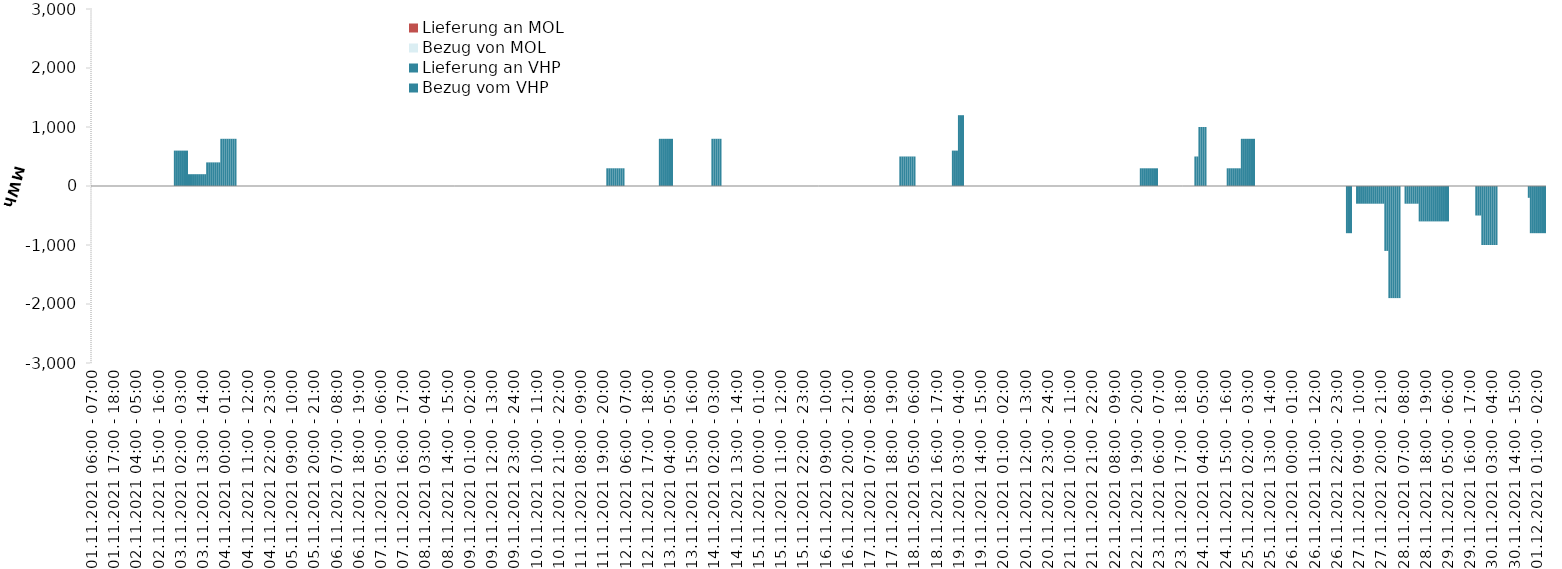
| Category | Bezug vom VHP | Lieferung an VHP | Bezug von MOL | Lieferung an MOL |
|---|---|---|---|---|
| 01.11.2021 06:00 - 07:00 | 0 | 0 | 0 | 0 |
| 01.11.2021 07:00 - 08:00 | 0 | 0 | 0 | 0 |
| 01.11.2021 08:00 - 09:00 | 0 | 0 | 0 | 0 |
| 01.11.2021 09:00 - 10:00 | 0 | 0 | 0 | 0 |
| 01.11.2021 10:00 - 11:00 | 0 | 0 | 0 | 0 |
| 01.11.2021 11:00 - 12:00 | 0 | 0 | 0 | 0 |
| 01.11.2021 12:00 - 13:00 | 0 | 0 | 0 | 0 |
| 01.11.2021 13:00 - 14:00 | 0 | 0 | 0 | 0 |
| 01.11.2021 14:00 - 15:00 | 0 | 0 | 0 | 0 |
| 01.11.2021 15:00 - 16:00 | 0 | 0 | 0 | 0 |
| 01.11.2021 16:00 - 17:00 | 0 | 0 | 0 | 0 |
| 01.11.2021 17:00 - 18:00 | 0 | 0 | 0 | 0 |
| 01.11.2021 18:00 - 19:00 | 0 | 0 | 0 | 0 |
| 01.11.2021 19:00 - 20:00 | 0 | 0 | 0 | 0 |
| 01.11.2021 20:00 - 21:00 | 0 | 0 | 0 | 0 |
| 01.11.2021 21:00 - 22:00 | 0 | 0 | 0 | 0 |
| 01.11.2021 22:00 - 23:00 | 0 | 0 | 0 | 0 |
| 01.11.2021 23:00 - 24:00 | 0 | 0 | 0 | 0 |
| 02.11.2021 00:00 - 01:00 | 0 | 0 | 0 | 0 |
| 02.11.2021 01:00 - 02:00 | 0 | 0 | 0 | 0 |
| 02.11.2021 02:00 - 03:00 | 0 | 0 | 0 | 0 |
| 02.11.2021 03:00 - 04:00 | 0 | 0 | 0 | 0 |
| 02.11.2021 04:00 - 05:00 | 0 | 0 | 0 | 0 |
| 02.11.2021 05:00 - 06:00 | 0 | 0 | 0 | 0 |
| 02.11.2021 06:00 - 07:00 | 0 | 0 | 0 | 0 |
| 02.11.2021 07:00 - 08:00 | 0 | 0 | 0 | 0 |
| 02.11.2021 08:00 - 09:00 | 0 | 0 | 0 | 0 |
| 02.11.2021 09:00 - 10:00 | 0 | 0 | 0 | 0 |
| 02.11.2021 10:00 - 11:00 | 0 | 0 | 0 | 0 |
| 02.11.2021 11:00 - 12:00 | 0 | 0 | 0 | 0 |
| 02.11.2021 12:00 - 13:00 | 0 | 0 | 0 | 0 |
| 02.11.2021 13:00 - 14:00 | 0 | 0 | 0 | 0 |
| 02.11.2021 14:00 - 15:00 | 0 | 0 | 0 | 0 |
| 02.11.2021 15:00 - 16:00 | 0 | 0 | 0 | 0 |
| 02.11.2021 16:00 - 17:00 | 0 | 0 | 0 | 0 |
| 02.11.2021 17:00 - 18:00 | 0 | 0 | 0 | 0 |
| 02.11.2021 18:00 - 19:00 | 0 | 0 | 0 | 0 |
| 02.11.2021 19:00 - 20:00 | 0 | 0 | 0 | 0 |
| 02.11.2021 20:00 - 21:00 | 0 | 0 | 0 | 0 |
| 02.11.2021 21:00 - 22:00 | 0 | 0 | 0 | 0 |
| 02.11.2021 22:00 - 23:00 | 0 | 0 | 0 | 0 |
| 02.11.2021 23:00 - 24:00 | 600 | 0 | 0 | 0 |
| 03.11.2021 00:00 - 01:00 | 600 | 0 | 0 | 0 |
| 03.11.2021 01:00 - 02:00 | 600 | 0 | 0 | 0 |
| 03.11.2021 02:00 - 03:00 | 600 | 0 | 0 | 0 |
| 03.11.2021 03:00 - 04:00 | 600 | 0 | 0 | 0 |
| 03.11.2021 04:00 - 05:00 | 600 | 0 | 0 | 0 |
| 03.11.2021 05:00 - 06:00 | 600 | 0 | 0 | 0 |
| 03.11.2021 06:00 - 07:00 | 200 | 0 | 0 | 0 |
| 03.11.2021 07:00 - 08:00 | 200 | 0 | 0 | 0 |
| 03.11.2021 08:00 - 09:00 | 200 | 0 | 0 | 0 |
| 03.11.2021 09:00 - 10:00 | 200 | 0 | 0 | 0 |
| 03.11.2021 10:00 - 11:00 | 200 | 0 | 0 | 0 |
| 03.11.2021 11:00 - 12:00 | 200 | 0 | 0 | 0 |
| 03.11.2021 12:00 - 13:00 | 200 | 0 | 0 | 0 |
| 03.11.2021 13:00 - 14:00 | 200 | 0 | 0 | 0 |
| 03.11.2021 14:00 - 15:00 | 200 | 0 | 0 | 0 |
| 03.11.2021 15:00 - 16:00 | 400 | 0 | 0 | 0 |
| 03.11.2021 16:00 - 17:00 | 400 | 0 | 0 | 0 |
| 03.11.2021 17:00 - 18:00 | 400 | 0 | 0 | 0 |
| 03.11.2021 18:00 - 19:00 | 400 | 0 | 0 | 0 |
| 03.11.2021 19:00 - 20:00 | 400 | 0 | 0 | 0 |
| 03.11.2021 20:00 - 21:00 | 400 | 0 | 0 | 0 |
| 03.11.2021 21:00 - 22:00 | 400 | 0 | 0 | 0 |
| 03.11.2021 22:00 - 23:00 | 800 | 0 | 0 | 0 |
| 03.11.2021 23:00 - 24:00 | 800 | 0 | 0 | 0 |
| 04.11.2021 00:00 - 01:00 | 800 | 0 | 0 | 0 |
| 04.11.2021 01:00 - 02:00 | 800 | 0 | 0 | 0 |
| 04.11.2021 02:00 - 03:00 | 800 | 0 | 0 | 0 |
| 04.11.2021 03:00 - 04:00 | 800 | 0 | 0 | 0 |
| 04.11.2021 04:00 - 05:00 | 800 | 0 | 0 | 0 |
| 04.11.2021 05:00 - 06:00 | 800 | 0 | 0 | 0 |
| 04.11.2021 06:00 - 07:00 | 0 | 0 | 0 | 0 |
| 04.11.2021 07:00 - 08:00 | 0 | 0 | 0 | 0 |
| 04.11.2021 08:00 - 09:00 | 0 | 0 | 0 | 0 |
| 04.11.2021 09:00 - 10:00 | 0 | 0 | 0 | 0 |
| 04.11.2021 10:00 - 11:00 | 0 | 0 | 0 | 0 |
| 04.11.2021 11:00 - 12:00 | 0 | 0 | 0 | 0 |
| 04.11.2021 12:00 - 13:00 | 0 | 0 | 0 | 0 |
| 04.11.2021 13:00 - 14:00 | 0 | 0 | 0 | 0 |
| 04.11.2021 14:00 - 15:00 | 0 | 0 | 0 | 0 |
| 04.11.2021 15:00 - 16:00 | 0 | 0 | 0 | 0 |
| 04.11.2021 16:00 - 17:00 | 0 | 0 | 0 | 0 |
| 04.11.2021 17:00 - 18:00 | 0 | 0 | 0 | 0 |
| 04.11.2021 18:00 - 19:00 | 0 | 0 | 0 | 0 |
| 04.11.2021 19:00 - 20:00 | 0 | 0 | 0 | 0 |
| 04.11.2021 20:00 - 21:00 | 0 | 0 | 0 | 0 |
| 04.11.2021 21:00 - 22:00 | 0 | 0 | 0 | 0 |
| 04.11.2021 22:00 - 23:00 | 0 | 0 | 0 | 0 |
| 04.11.2021 23:00 - 24:00 | 0 | 0 | 0 | 0 |
| 05.11.2021 00:00 - 01:00 | 0 | 0 | 0 | 0 |
| 05.11.2021 01:00 - 02:00 | 0 | 0 | 0 | 0 |
| 05.11.2021 02:00 - 03:00 | 0 | 0 | 0 | 0 |
| 05.11.2021 03:00 - 04:00 | 0 | 0 | 0 | 0 |
| 05.11.2021 04:00 - 05:00 | 0 | 0 | 0 | 0 |
| 05.11.2021 05:00 - 06:00 | 0 | 0 | 0 | 0 |
| 05.11.2021 06:00 - 07:00 | 0 | 0 | 0 | 0 |
| 05.11.2021 07:00 - 08:00 | 0 | 0 | 0 | 0 |
| 05.11.2021 08:00 - 09:00 | 0 | 0 | 0 | 0 |
| 05.11.2021 09:00 - 10:00 | 0 | 0 | 0 | 0 |
| 05.11.2021 10:00 - 11:00 | 0 | 0 | 0 | 0 |
| 05.11.2021 11:00 - 12:00 | 0 | 0 | 0 | 0 |
| 05.11.2021 12:00 - 13:00 | 0 | 0 | 0 | 0 |
| 05.11.2021 13:00 - 14:00 | 0 | 0 | 0 | 0 |
| 05.11.2021 14:00 - 15:00 | 0 | 0 | 0 | 0 |
| 05.11.2021 15:00 - 16:00 | 0 | 0 | 0 | 0 |
| 05.11.2021 16:00 - 17:00 | 0 | 0 | 0 | 0 |
| 05.11.2021 17:00 - 18:00 | 0 | 0 | 0 | 0 |
| 05.11.2021 18:00 - 19:00 | 0 | 0 | 0 | 0 |
| 05.11.2021 19:00 - 20:00 | 0 | 0 | 0 | 0 |
| 05.11.2021 20:00 - 21:00 | 0 | 0 | 0 | 0 |
| 05.11.2021 21:00 - 22:00 | 0 | 0 | 0 | 0 |
| 05.11.2021 22:00 - 23:00 | 0 | 0 | 0 | 0 |
| 05.11.2021 23:00 - 24:00 | 0 | 0 | 0 | 0 |
| 06.11.2021 00:00 - 01:00 | 0 | 0 | 0 | 0 |
| 06.11.2021 01:00 - 02:00 | 0 | 0 | 0 | 0 |
| 06.11.2021 02:00 - 03:00 | 0 | 0 | 0 | 0 |
| 06.11.2021 03:00 - 04:00 | 0 | 0 | 0 | 0 |
| 06.11.2021 04:00 - 05:00 | 0 | 0 | 0 | 0 |
| 06.11.2021 05:00 - 06:00 | 0 | 0 | 0 | 0 |
| 06.11.2021 06:00 - 07:00 | 0 | 0 | 0 | 0 |
| 06.11.2021 07:00 - 08:00 | 0 | 0 | 0 | 0 |
| 06.11.2021 08:00 - 09:00 | 0 | 0 | 0 | 0 |
| 06.11.2021 09:00 - 10:00 | 0 | 0 | 0 | 0 |
| 06.11.2021 10:00 - 11:00 | 0 | 0 | 0 | 0 |
| 06.11.2021 11:00 - 12:00 | 0 | 0 | 0 | 0 |
| 06.11.2021 12:00 - 13:00 | 0 | 0 | 0 | 0 |
| 06.11.2021 13:00 - 14:00 | 0 | 0 | 0 | 0 |
| 06.11.2021 14:00 - 15:00 | 0 | 0 | 0 | 0 |
| 06.11.2021 15:00 - 16:00 | 0 | 0 | 0 | 0 |
| 06.11.2021 16:00 - 17:00 | 0 | 0 | 0 | 0 |
| 06.11.2021 17:00 - 18:00 | 0 | 0 | 0 | 0 |
| 06.11.2021 18:00 - 19:00 | 0 | 0 | 0 | 0 |
| 06.11.2021 19:00 - 20:00 | 0 | 0 | 0 | 0 |
| 06.11.2021 20:00 - 21:00 | 0 | 0 | 0 | 0 |
| 06.11.2021 21:00 - 22:00 | 0 | 0 | 0 | 0 |
| 06.11.2021 22:00 - 23:00 | 0 | 0 | 0 | 0 |
| 06.11.2021 23:00 - 24:00 | 0 | 0 | 0 | 0 |
| 07.11.2021 00:00 - 01:00 | 0 | 0 | 0 | 0 |
| 07.11.2021 01:00 - 02:00 | 0 | 0 | 0 | 0 |
| 07.11.2021 02:00 - 03:00 | 0 | 0 | 0 | 0 |
| 07.11.2021 03:00 - 04:00 | 0 | 0 | 0 | 0 |
| 07.11.2021 04:00 - 05:00 | 0 | 0 | 0 | 0 |
| 07.11.2021 05:00 - 06:00 | 0 | 0 | 0 | 0 |
| 07.11.2021 06:00 - 07:00 | 0 | 0 | 0 | 0 |
| 07.11.2021 07:00 - 08:00 | 0 | 0 | 0 | 0 |
| 07.11.2021 08:00 - 09:00 | 0 | 0 | 0 | 0 |
| 07.11.2021 09:00 - 10:00 | 0 | 0 | 0 | 0 |
| 07.11.2021 10:00 - 11:00 | 0 | 0 | 0 | 0 |
| 07.11.2021 11:00 - 12:00 | 0 | 0 | 0 | 0 |
| 07.11.2021 12:00 - 13:00 | 0 | 0 | 0 | 0 |
| 07.11.2021 13:00 - 14:00 | 0 | 0 | 0 | 0 |
| 07.11.2021 14:00 - 15:00 | 0 | 0 | 0 | 0 |
| 07.11.2021 15:00 - 16:00 | 0 | 0 | 0 | 0 |
| 07.11.2021 16:00 - 17:00 | 0 | 0 | 0 | 0 |
| 07.11.2021 17:00 - 18:00 | 0 | 0 | 0 | 0 |
| 07.11.2021 18:00 - 19:00 | 0 | 0 | 0 | 0 |
| 07.11.2021 19:00 - 20:00 | 0 | 0 | 0 | 0 |
| 07.11.2021 20:00 - 21:00 | 0 | 0 | 0 | 0 |
| 07.11.2021 21:00 - 22:00 | 0 | 0 | 0 | 0 |
| 07.11.2021 22:00 - 23:00 | 0 | 0 | 0 | 0 |
| 07.11.2021 23:00 - 24:00 | 0 | 0 | 0 | 0 |
| 08.11.2021 00:00 - 01:00 | 0 | 0 | 0 | 0 |
| 08.11.2021 01:00 - 02:00 | 0 | 0 | 0 | 0 |
| 08.11.2021 02:00 - 03:00 | 0 | 0 | 0 | 0 |
| 08.11.2021 03:00 - 04:00 | 0 | 0 | 0 | 0 |
| 08.11.2021 04:00 - 05:00 | 0 | 0 | 0 | 0 |
| 08.11.2021 05:00 - 06:00 | 0 | 0 | 0 | 0 |
| 08.11.2021 06:00 - 07:00 | 0 | 0 | 0 | 0 |
| 08.11.2021 07:00 - 08:00 | 0 | 0 | 0 | 0 |
| 08.11.2021 08:00 - 09:00 | 0 | 0 | 0 | 0 |
| 08.11.2021 09:00 - 10:00 | 0 | 0 | 0 | 0 |
| 08.11.2021 10:00 - 11:00 | 0 | 0 | 0 | 0 |
| 08.11.2021 11:00 - 12:00 | 0 | 0 | 0 | 0 |
| 08.11.2021 12:00 - 13:00 | 0 | 0 | 0 | 0 |
| 08.11.2021 13:00 - 14:00 | 0 | 0 | 0 | 0 |
| 08.11.2021 14:00 - 15:00 | 0 | 0 | 0 | 0 |
| 08.11.2021 15:00 - 16:00 | 0 | 0 | 0 | 0 |
| 08.11.2021 16:00 - 17:00 | 0 | 0 | 0 | 0 |
| 08.11.2021 17:00 - 18:00 | 0 | 0 | 0 | 0 |
| 08.11.2021 18:00 - 19:00 | 0 | 0 | 0 | 0 |
| 08.11.2021 19:00 - 20:00 | 0 | 0 | 0 | 0 |
| 08.11.2021 20:00 - 21:00 | 0 | 0 | 0 | 0 |
| 08.11.2021 21:00 - 22:00 | 0 | 0 | 0 | 0 |
| 08.11.2021 22:00 - 23:00 | 0 | 0 | 0 | 0 |
| 08.11.2021 23:00 - 24:00 | 0 | 0 | 0 | 0 |
| 09.11.2021 00:00 - 01:00 | 0 | 0 | 0 | 0 |
| 09.11.2021 01:00 - 02:00 | 0 | 0 | 0 | 0 |
| 09.11.2021 02:00 - 03:00 | 0 | 0 | 0 | 0 |
| 09.11.2021 03:00 - 04:00 | 0 | 0 | 0 | 0 |
| 09.11.2021 04:00 - 05:00 | 0 | 0 | 0 | 0 |
| 09.11.2021 05:00 - 06:00 | 0 | 0 | 0 | 0 |
| 09.11.2021 06:00 - 07:00 | 0 | 0 | 0 | 0 |
| 09.11.2021 07:00 - 08:00 | 0 | 0 | 0 | 0 |
| 09.11.2021 08:00 - 09:00 | 0 | 0 | 0 | 0 |
| 09.11.2021 09:00 - 10:00 | 0 | 0 | 0 | 0 |
| 09.11.2021 10:00 - 11:00 | 0 | 0 | 0 | 0 |
| 09.11.2021 11:00 - 12:00 | 0 | 0 | 0 | 0 |
| 09.11.2021 12:00 - 13:00 | 0 | 0 | 0 | 0 |
| 09.11.2021 13:00 - 14:00 | 0 | 0 | 0 | 0 |
| 09.11.2021 14:00 - 15:00 | 0 | 0 | 0 | 0 |
| 09.11.2021 15:00 - 16:00 | 0 | 0 | 0 | 0 |
| 09.11.2021 16:00 - 17:00 | 0 | 0 | 0 | 0 |
| 09.11.2021 17:00 - 18:00 | 0 | 0 | 0 | 0 |
| 09.11.2021 18:00 - 19:00 | 0 | 0 | 0 | 0 |
| 09.11.2021 19:00 - 20:00 | 0 | 0 | 0 | 0 |
| 09.11.2021 20:00 - 21:00 | 0 | 0 | 0 | 0 |
| 09.11.2021 21:00 - 22:00 | 0 | 0 | 0 | 0 |
| 09.11.2021 22:00 - 23:00 | 0 | 0 | 0 | 0 |
| 09.11.2021 23:00 - 24:00 | 0 | 0 | 0 | 0 |
| 10.11.2021 00:00 - 01:00 | 0 | 0 | 0 | 0 |
| 10.11.2021 01:00 - 02:00 | 0 | 0 | 0 | 0 |
| 10.11.2021 02:00 - 03:00 | 0 | 0 | 0 | 0 |
| 10.11.2021 03:00 - 04:00 | 0 | 0 | 0 | 0 |
| 10.11.2021 04:00 - 05:00 | 0 | 0 | 0 | 0 |
| 10.11.2021 05:00 - 06:00 | 0 | 0 | 0 | 0 |
| 10.11.2021 06:00 - 07:00 | 0 | 0 | 0 | 0 |
| 10.11.2021 07:00 - 08:00 | 0 | 0 | 0 | 0 |
| 10.11.2021 08:00 - 09:00 | 0 | 0 | 0 | 0 |
| 10.11.2021 09:00 - 10:00 | 0 | 0 | 0 | 0 |
| 10.11.2021 10:00 - 11:00 | 0 | 0 | 0 | 0 |
| 10.11.2021 11:00 - 12:00 | 0 | 0 | 0 | 0 |
| 10.11.2021 12:00 - 13:00 | 0 | 0 | 0 | 0 |
| 10.11.2021 13:00 - 14:00 | 0 | 0 | 0 | 0 |
| 10.11.2021 14:00 - 15:00 | 0 | 0 | 0 | 0 |
| 10.11.2021 15:00 - 16:00 | 0 | 0 | 0 | 0 |
| 10.11.2021 16:00 - 17:00 | 0 | 0 | 0 | 0 |
| 10.11.2021 17:00 - 18:00 | 0 | 0 | 0 | 0 |
| 10.11.2021 18:00 - 19:00 | 0 | 0 | 0 | 0 |
| 10.11.2021 19:00 - 20:00 | 0 | 0 | 0 | 0 |
| 10.11.2021 20:00 - 21:00 | 0 | 0 | 0 | 0 |
| 10.11.2021 21:00 - 22:00 | 0 | 0 | 0 | 0 |
| 10.11.2021 22:00 - 23:00 | 0 | 0 | 0 | 0 |
| 10.11.2021 23:00 - 24:00 | 0 | 0 | 0 | 0 |
| 11.11.2021 00:00 - 01:00 | 0 | 0 | 0 | 0 |
| 11.11.2021 01:00 - 02:00 | 0 | 0 | 0 | 0 |
| 11.11.2021 02:00 - 03:00 | 0 | 0 | 0 | 0 |
| 11.11.2021 03:00 - 04:00 | 0 | 0 | 0 | 0 |
| 11.11.2021 04:00 - 05:00 | 0 | 0 | 0 | 0 |
| 11.11.2021 05:00 - 06:00 | 0 | 0 | 0 | 0 |
| 11.11.2021 06:00 - 07:00 | 0 | 0 | 0 | 0 |
| 11.11.2021 07:00 - 08:00 | 0 | 0 | 0 | 0 |
| 11.11.2021 08:00 - 09:00 | 0 | 0 | 0 | 0 |
| 11.11.2021 09:00 - 10:00 | 0 | 0 | 0 | 0 |
| 11.11.2021 10:00 - 11:00 | 0 | 0 | 0 | 0 |
| 11.11.2021 11:00 - 12:00 | 0 | 0 | 0 | 0 |
| 11.11.2021 12:00 - 13:00 | 0 | 0 | 0 | 0 |
| 11.11.2021 13:00 - 14:00 | 0 | 0 | 0 | 0 |
| 11.11.2021 14:00 - 15:00 | 0 | 0 | 0 | 0 |
| 11.11.2021 15:00 - 16:00 | 0 | 0 | 0 | 0 |
| 11.11.2021 16:00 - 17:00 | 0 | 0 | 0 | 0 |
| 11.11.2021 17:00 - 18:00 | 0 | 0 | 0 | 0 |
| 11.11.2021 18:00 - 19:00 | 0 | 0 | 0 | 0 |
| 11.11.2021 19:00 - 20:00 | 0 | 0 | 0 | 0 |
| 11.11.2021 20:00 - 21:00 | 0 | 0 | 0 | 0 |
| 11.11.2021 21:00 - 22:00 | 300 | 0 | 0 | 0 |
| 11.11.2021 22:00 - 23:00 | 300 | 0 | 0 | 0 |
| 11.11.2021 23:00 - 24:00 | 300 | 0 | 0 | 0 |
| 12.11.2021 00:00 - 01:00 | 300 | 0 | 0 | 0 |
| 12.11.2021 01:00 - 02:00 | 300 | 0 | 0 | 0 |
| 12.11.2021 02:00 - 03:00 | 300 | 0 | 0 | 0 |
| 12.11.2021 03:00 - 04:00 | 300 | 0 | 0 | 0 |
| 12.11.2021 04:00 - 05:00 | 300 | 0 | 0 | 0 |
| 12.11.2021 05:00 - 06:00 | 300 | 0 | 0 | 0 |
| 12.11.2021 06:00 - 07:00 | 0 | 0 | 0 | 0 |
| 12.11.2021 07:00 - 08:00 | 0 | 0 | 0 | 0 |
| 12.11.2021 08:00 - 09:00 | 0 | 0 | 0 | 0 |
| 12.11.2021 09:00 - 10:00 | 0 | 0 | 0 | 0 |
| 12.11.2021 10:00 - 11:00 | 0 | 0 | 0 | 0 |
| 12.11.2021 11:00 - 12:00 | 0 | 0 | 0 | 0 |
| 12.11.2021 12:00 - 13:00 | 0 | 0 | 0 | 0 |
| 12.11.2021 13:00 - 14:00 | 0 | 0 | 0 | 0 |
| 12.11.2021 14:00 - 15:00 | 0 | 0 | 0 | 0 |
| 12.11.2021 15:00 - 16:00 | 0 | 0 | 0 | 0 |
| 12.11.2021 16:00 - 17:00 | 0 | 0 | 0 | 0 |
| 12.11.2021 17:00 - 18:00 | 0 | 0 | 0 | 0 |
| 12.11.2021 18:00 - 19:00 | 0 | 0 | 0 | 0 |
| 12.11.2021 19:00 - 20:00 | 0 | 0 | 0 | 0 |
| 12.11.2021 20:00 - 21:00 | 0 | 0 | 0 | 0 |
| 12.11.2021 21:00 - 22:00 | 0 | 0 | 0 | 0 |
| 12.11.2021 22:00 - 23:00 | 0 | 0 | 0 | 0 |
| 12.11.2021 23:00 - 24:00 | 800 | 0 | 0 | 0 |
| 13.11.2021 00:00 - 01:00 | 800 | 0 | 0 | 0 |
| 13.11.2021 01:00 - 02:00 | 800 | 0 | 0 | 0 |
| 13.11.2021 02:00 - 03:00 | 800 | 0 | 0 | 0 |
| 13.11.2021 03:00 - 04:00 | 800 | 0 | 0 | 0 |
| 13.11.2021 04:00 - 05:00 | 800 | 0 | 0 | 0 |
| 13.11.2021 05:00 - 06:00 | 800 | 0 | 0 | 0 |
| 13.11.2021 06:00 - 07:00 | 0 | 0 | 0 | 0 |
| 13.11.2021 07:00 - 08:00 | 0 | 0 | 0 | 0 |
| 13.11.2021 08:00 - 09:00 | 0 | 0 | 0 | 0 |
| 13.11.2021 09:00 - 10:00 | 0 | 0 | 0 | 0 |
| 13.11.2021 10:00 - 11:00 | 0 | 0 | 0 | 0 |
| 13.11.2021 11:00 - 12:00 | 0 | 0 | 0 | 0 |
| 13.11.2021 12:00 - 13:00 | 0 | 0 | 0 | 0 |
| 13.11.2021 13:00 - 14:00 | 0 | 0 | 0 | 0 |
| 13.11.2021 14:00 - 15:00 | 0 | 0 | 0 | 0 |
| 13.11.2021 15:00 - 16:00 | 0 | 0 | 0 | 0 |
| 13.11.2021 16:00 - 17:00 | 0 | 0 | 0 | 0 |
| 13.11.2021 17:00 - 18:00 | 0 | 0 | 0 | 0 |
| 13.11.2021 18:00 - 19:00 | 0 | 0 | 0 | 0 |
| 13.11.2021 19:00 - 20:00 | 0 | 0 | 0 | 0 |
| 13.11.2021 20:00 - 21:00 | 0 | 0 | 0 | 0 |
| 13.11.2021 21:00 - 22:00 | 0 | 0 | 0 | 0 |
| 13.11.2021 22:00 - 23:00 | 0 | 0 | 0 | 0 |
| 13.11.2021 23:00 - 24:00 | 0 | 0 | 0 | 0 |
| 14.11.2021 00:00 - 01:00 | 0 | 0 | 0 | 0 |
| 14.11.2021 01:00 - 02:00 | 800 | 0 | 0 | 0 |
| 14.11.2021 02:00 - 03:00 | 800 | 0 | 0 | 0 |
| 14.11.2021 03:00 - 04:00 | 800 | 0 | 0 | 0 |
| 14.11.2021 04:00 - 05:00 | 800 | 0 | 0 | 0 |
| 14.11.2021 05:00 - 06:00 | 800 | 0 | 0 | 0 |
| 14.11.2021 06:00 - 07:00 | 0 | 0 | 0 | 0 |
| 14.11.2021 07:00 - 08:00 | 0 | 0 | 0 | 0 |
| 14.11.2021 08:00 - 09:00 | 0 | 0 | 0 | 0 |
| 14.11.2021 09:00 - 10:00 | 0 | 0 | 0 | 0 |
| 14.11.2021 10:00 - 11:00 | 0 | 0 | 0 | 0 |
| 14.11.2021 11:00 - 12:00 | 0 | 0 | 0 | 0 |
| 14.11.2021 12:00 - 13:00 | 0 | 0 | 0 | 0 |
| 14.11.2021 13:00 - 14:00 | 0 | 0 | 0 | 0 |
| 14.11.2021 14:00 - 15:00 | 0 | 0 | 0 | 0 |
| 14.11.2021 15:00 - 16:00 | 0 | 0 | 0 | 0 |
| 14.11.2021 16:00 - 17:00 | 0 | 0 | 0 | 0 |
| 14.11.2021 17:00 - 18:00 | 0 | 0 | 0 | 0 |
| 14.11.2021 18:00 - 19:00 | 0 | 0 | 0 | 0 |
| 14.11.2021 19:00 - 20:00 | 0 | 0 | 0 | 0 |
| 14.11.2021 20:00 - 21:00 | 0 | 0 | 0 | 0 |
| 14.11.2021 21:00 - 22:00 | 0 | 0 | 0 | 0 |
| 14.11.2021 22:00 - 23:00 | 0 | 0 | 0 | 0 |
| 14.11.2021 23:00 - 24:00 | 0 | 0 | 0 | 0 |
| 15.11.2021 00:00 - 01:00 | 0 | 0 | 0 | 0 |
| 15.11.2021 01:00 - 02:00 | 0 | 0 | 0 | 0 |
| 15.11.2021 02:00 - 03:00 | 0 | 0 | 0 | 0 |
| 15.11.2021 03:00 - 04:00 | 0 | 0 | 0 | 0 |
| 15.11.2021 04:00 - 05:00 | 0 | 0 | 0 | 0 |
| 15.11.2021 05:00 - 06:00 | 0 | 0 | 0 | 0 |
| 15.11.2021 06:00 - 07:00 | 0 | 0 | 0 | 0 |
| 15.11.2021 07:00 - 08:00 | 0 | 0 | 0 | 0 |
| 15.11.2021 08:00 - 09:00 | 0 | 0 | 0 | 0 |
| 15.11.2021 09:00 - 10:00 | 0 | 0 | 0 | 0 |
| 15.11.2021 10:00 - 11:00 | 0 | 0 | 0 | 0 |
| 15.11.2021 11:00 - 12:00 | 0 | 0 | 0 | 0 |
| 15.11.2021 12:00 - 13:00 | 0 | 0 | 0 | 0 |
| 15.11.2021 13:00 - 14:00 | 0 | 0 | 0 | 0 |
| 15.11.2021 14:00 - 15:00 | 0 | 0 | 0 | 0 |
| 15.11.2021 15:00 - 16:00 | 0 | 0 | 0 | 0 |
| 15.11.2021 16:00 - 17:00 | 0 | 0 | 0 | 0 |
| 15.11.2021 17:00 - 18:00 | 0 | 0 | 0 | 0 |
| 15.11.2021 18:00 - 19:00 | 0 | 0 | 0 | 0 |
| 15.11.2021 19:00 - 20:00 | 0 | 0 | 0 | 0 |
| 15.11.2021 20:00 - 21:00 | 0 | 0 | 0 | 0 |
| 15.11.2021 21:00 - 22:00 | 0 | 0 | 0 | 0 |
| 15.11.2021 22:00 - 23:00 | 0 | 0 | 0 | 0 |
| 15.11.2021 23:00 - 24:00 | 0 | 0 | 0 | 0 |
| 16.11.2021 00:00 - 01:00 | 0 | 0 | 0 | 0 |
| 16.11.2021 01:00 - 02:00 | 0 | 0 | 0 | 0 |
| 16.11.2021 02:00 - 03:00 | 0 | 0 | 0 | 0 |
| 16.11.2021 03:00 - 04:00 | 0 | 0 | 0 | 0 |
| 16.11.2021 04:00 - 05:00 | 0 | 0 | 0 | 0 |
| 16.11.2021 05:00 - 06:00 | 0 | 0 | 0 | 0 |
| 16.11.2021 06:00 - 07:00 | 0 | 0 | 0 | 0 |
| 16.11.2021 07:00 - 08:00 | 0 | 0 | 0 | 0 |
| 16.11.2021 08:00 - 09:00 | 0 | 0 | 0 | 0 |
| 16.11.2021 09:00 - 10:00 | 0 | 0 | 0 | 0 |
| 16.11.2021 10:00 - 11:00 | 0 | 0 | 0 | 0 |
| 16.11.2021 11:00 - 12:00 | 0 | 0 | 0 | 0 |
| 16.11.2021 12:00 - 13:00 | 0 | 0 | 0 | 0 |
| 16.11.2021 13:00 - 14:00 | 0 | 0 | 0 | 0 |
| 16.11.2021 14:00 - 15:00 | 0 | 0 | 0 | 0 |
| 16.11.2021 15:00 - 16:00 | 0 | 0 | 0 | 0 |
| 16.11.2021 16:00 - 17:00 | 0 | 0 | 0 | 0 |
| 16.11.2021 17:00 - 18:00 | 0 | 0 | 0 | 0 |
| 16.11.2021 18:00 - 19:00 | 0 | 0 | 0 | 0 |
| 16.11.2021 19:00 - 20:00 | 0 | 0 | 0 | 0 |
| 16.11.2021 20:00 - 21:00 | 0 | 0 | 0 | 0 |
| 16.11.2021 21:00 - 22:00 | 0 | 0 | 0 | 0 |
| 16.11.2021 22:00 - 23:00 | 0 | 0 | 0 | 0 |
| 16.11.2021 23:00 - 24:00 | 0 | 0 | 0 | 0 |
| 17.11.2021 00:00 - 01:00 | 0 | 0 | 0 | 0 |
| 17.11.2021 01:00 - 02:00 | 0 | 0 | 0 | 0 |
| 17.11.2021 02:00 - 03:00 | 0 | 0 | 0 | 0 |
| 17.11.2021 03:00 - 04:00 | 0 | 0 | 0 | 0 |
| 17.11.2021 04:00 - 05:00 | 0 | 0 | 0 | 0 |
| 17.11.2021 05:00 - 06:00 | 0 | 0 | 0 | 0 |
| 17.11.2021 06:00 - 07:00 | 0 | 0 | 0 | 0 |
| 17.11.2021 07:00 - 08:00 | 0 | 0 | 0 | 0 |
| 17.11.2021 08:00 - 09:00 | 0 | 0 | 0 | 0 |
| 17.11.2021 09:00 - 10:00 | 0 | 0 | 0 | 0 |
| 17.11.2021 10:00 - 11:00 | 0 | 0 | 0 | 0 |
| 17.11.2021 11:00 - 12:00 | 0 | 0 | 0 | 0 |
| 17.11.2021 12:00 - 13:00 | 0 | 0 | 0 | 0 |
| 17.11.2021 13:00 - 14:00 | 0 | 0 | 0 | 0 |
| 17.11.2021 14:00 - 15:00 | 0 | 0 | 0 | 0 |
| 17.11.2021 15:00 - 16:00 | 0 | 0 | 0 | 0 |
| 17.11.2021 16:00 - 17:00 | 0 | 0 | 0 | 0 |
| 17.11.2021 17:00 - 18:00 | 0 | 0 | 0 | 0 |
| 17.11.2021 18:00 - 19:00 | 0 | 0 | 0 | 0 |
| 17.11.2021 19:00 - 20:00 | 0 | 0 | 0 | 0 |
| 17.11.2021 20:00 - 21:00 | 0 | 0 | 0 | 0 |
| 17.11.2021 21:00 - 22:00 | 0 | 0 | 0 | 0 |
| 17.11.2021 22:00 - 23:00 | 500 | 0 | 0 | 0 |
| 17.11.2021 23:00 - 24:00 | 500 | 0 | 0 | 0 |
| 18.11.2021 00:00 - 01:00 | 500 | 0 | 0 | 0 |
| 18.11.2021 01:00 - 02:00 | 500 | 0 | 0 | 0 |
| 18.11.2021 02:00 - 03:00 | 500 | 0 | 0 | 0 |
| 18.11.2021 03:00 - 04:00 | 500 | 0 | 0 | 0 |
| 18.11.2021 04:00 - 05:00 | 500 | 0 | 0 | 0 |
| 18.11.2021 05:00 - 06:00 | 500 | 0 | 0 | 0 |
| 18.11.2021 06:00 - 07:00 | 0 | 0 | 0 | 0 |
| 18.11.2021 07:00 - 08:00 | 0 | 0 | 0 | 0 |
| 18.11.2021 08:00 - 09:00 | 0 | 0 | 0 | 0 |
| 18.11.2021 09:00 - 10:00 | 0 | 0 | 0 | 0 |
| 18.11.2021 10:00 - 11:00 | 0 | 0 | 0 | 0 |
| 18.11.2021 11:00 - 12:00 | 0 | 0 | 0 | 0 |
| 18.11.2021 12:00 - 13:00 | 0 | 0 | 0 | 0 |
| 18.11.2021 13:00 - 14:00 | 0 | 0 | 0 | 0 |
| 18.11.2021 14:00 - 15:00 | 0 | 0 | 0 | 0 |
| 18.11.2021 15:00 - 16:00 | 0 | 0 | 0 | 0 |
| 18.11.2021 16:00 - 17:00 | 0 | 0 | 0 | 0 |
| 18.11.2021 17:00 - 18:00 | 0 | 0 | 0 | 0 |
| 18.11.2021 18:00 - 19:00 | 0 | 0 | 0 | 0 |
| 18.11.2021 19:00 - 20:00 | 0 | 0 | 0 | 0 |
| 18.11.2021 20:00 - 21:00 | 0 | 0 | 0 | 0 |
| 18.11.2021 21:00 - 22:00 | 0 | 0 | 0 | 0 |
| 18.11.2021 22:00 - 23:00 | 0 | 0 | 0 | 0 |
| 18.11.2021 23:00 - 24:00 | 0 | 0 | 0 | 0 |
| 19.11.2021 00:00 - 01:00 | 600 | 0 | 0 | 0 |
| 19.11.2021 01:00 - 02:00 | 600 | 0 | 0 | 0 |
| 19.11.2021 02:00 - 03:00 | 600 | 0 | 0 | 0 |
| 19.11.2021 03:00 - 04:00 | 1200 | 0 | 0 | 0 |
| 19.11.2021 04:00 - 05:00 | 1200 | 0 | 0 | 0 |
| 19.11.2021 05:00 - 06:00 | 1200 | 0 | 0 | 0 |
| 19.11.2021 06:00 - 07:00 | 0 | 0 | 0 | 0 |
| 19.11.2021 07:00 - 08:00 | 0 | 0 | 0 | 0 |
| 19.11.2021 08:00 - 09:00 | 0 | 0 | 0 | 0 |
| 19.11.2021 09:00 - 10:00 | 0 | 0 | 0 | 0 |
| 19.11.2021 10:00 - 11:00 | 0 | 0 | 0 | 0 |
| 19.11.2021 11:00 - 12:00 | 0 | 0 | 0 | 0 |
| 19.11.2021 12:00 - 13:00 | 0 | 0 | 0 | 0 |
| 19.11.2021 13:00 - 14:00 | 0 | 0 | 0 | 0 |
| 19.11.2021 14:00 - 15:00 | 0 | 0 | 0 | 0 |
| 19.11.2021 15:00 - 16:00 | 0 | 0 | 0 | 0 |
| 19.11.2021 16:00 - 17:00 | 0 | 0 | 0 | 0 |
| 19.11.2021 17:00 - 18:00 | 0 | 0 | 0 | 0 |
| 19.11.2021 18:00 - 19:00 | 0 | 0 | 0 | 0 |
| 19.11.2021 19:00 - 20:00 | 0 | 0 | 0 | 0 |
| 19.11.2021 20:00 - 21:00 | 0 | 0 | 0 | 0 |
| 19.11.2021 21:00 - 22:00 | 0 | 0 | 0 | 0 |
| 19.11.2021 22:00 - 23:00 | 0 | 0 | 0 | 0 |
| 19.11.2021 23:00 - 24:00 | 0 | 0 | 0 | 0 |
| 20.11.2021 00:00 - 01:00 | 0 | 0 | 0 | 0 |
| 20.11.2021 01:00 - 02:00 | 0 | 0 | 0 | 0 |
| 20.11.2021 02:00 - 03:00 | 0 | 0 | 0 | 0 |
| 20.11.2021 03:00 - 04:00 | 0 | 0 | 0 | 0 |
| 20.11.2021 04:00 - 05:00 | 0 | 0 | 0 | 0 |
| 20.11.2021 05:00 - 06:00 | 0 | 0 | 0 | 0 |
| 20.11.2021 06:00 - 07:00 | 0 | 0 | 0 | 0 |
| 20.11.2021 07:00 - 08:00 | 0 | 0 | 0 | 0 |
| 20.11.2021 08:00 - 09:00 | 0 | 0 | 0 | 0 |
| 20.11.2021 09:00 - 10:00 | 0 | 0 | 0 | 0 |
| 20.11.2021 10:00 - 11:00 | 0 | 0 | 0 | 0 |
| 20.11.2021 11:00 - 12:00 | 0 | 0 | 0 | 0 |
| 20.11.2021 12:00 - 13:00 | 0 | 0 | 0 | 0 |
| 20.11.2021 13:00 - 14:00 | 0 | 0 | 0 | 0 |
| 20.11.2021 14:00 - 15:00 | 0 | 0 | 0 | 0 |
| 20.11.2021 15:00 - 16:00 | 0 | 0 | 0 | 0 |
| 20.11.2021 16:00 - 17:00 | 0 | 0 | 0 | 0 |
| 20.11.2021 17:00 - 18:00 | 0 | 0 | 0 | 0 |
| 20.11.2021 18:00 - 19:00 | 0 | 0 | 0 | 0 |
| 20.11.2021 19:00 - 20:00 | 0 | 0 | 0 | 0 |
| 20.11.2021 20:00 - 21:00 | 0 | 0 | 0 | 0 |
| 20.11.2021 21:00 - 22:00 | 0 | 0 | 0 | 0 |
| 20.11.2021 22:00 - 23:00 | 0 | 0 | 0 | 0 |
| 20.11.2021 23:00 - 24:00 | 0 | 0 | 0 | 0 |
| 21.11.2021 00:00 - 01:00 | 0 | 0 | 0 | 0 |
| 21.11.2021 01:00 - 02:00 | 0 | 0 | 0 | 0 |
| 21.11.2021 02:00 - 03:00 | 0 | 0 | 0 | 0 |
| 21.11.2021 03:00 - 04:00 | 0 | 0 | 0 | 0 |
| 21.11.2021 04:00 - 05:00 | 0 | 0 | 0 | 0 |
| 21.11.2021 05:00 - 06:00 | 0 | 0 | 0 | 0 |
| 21.11.2021 06:00 - 07:00 | 0 | 0 | 0 | 0 |
| 21.11.2021 07:00 - 08:00 | 0 | 0 | 0 | 0 |
| 21.11.2021 08:00 - 09:00 | 0 | 0 | 0 | 0 |
| 21.11.2021 09:00 - 10:00 | 0 | 0 | 0 | 0 |
| 21.11.2021 10:00 - 11:00 | 0 | 0 | 0 | 0 |
| 21.11.2021 11:00 - 12:00 | 0 | 0 | 0 | 0 |
| 21.11.2021 12:00 - 13:00 | 0 | 0 | 0 | 0 |
| 21.11.2021 13:00 - 14:00 | 0 | 0 | 0 | 0 |
| 21.11.2021 14:00 - 15:00 | 0 | 0 | 0 | 0 |
| 21.11.2021 15:00 - 16:00 | 0 | 0 | 0 | 0 |
| 21.11.2021 16:00 - 17:00 | 0 | 0 | 0 | 0 |
| 21.11.2021 17:00 - 18:00 | 0 | 0 | 0 | 0 |
| 21.11.2021 18:00 - 19:00 | 0 | 0 | 0 | 0 |
| 21.11.2021 19:00 - 20:00 | 0 | 0 | 0 | 0 |
| 21.11.2021 20:00 - 21:00 | 0 | 0 | 0 | 0 |
| 21.11.2021 21:00 - 22:00 | 0 | 0 | 0 | 0 |
| 21.11.2021 22:00 - 23:00 | 0 | 0 | 0 | 0 |
| 21.11.2021 23:00 - 24:00 | 0 | 0 | 0 | 0 |
| 22.11.2021 00:00 - 01:00 | 0 | 0 | 0 | 0 |
| 22.11.2021 01:00 - 02:00 | 0 | 0 | 0 | 0 |
| 22.11.2021 02:00 - 03:00 | 0 | 0 | 0 | 0 |
| 22.11.2021 03:00 - 04:00 | 0 | 0 | 0 | 0 |
| 22.11.2021 04:00 - 05:00 | 0 | 0 | 0 | 0 |
| 22.11.2021 05:00 - 06:00 | 0 | 0 | 0 | 0 |
| 22.11.2021 06:00 - 07:00 | 0 | 0 | 0 | 0 |
| 22.11.2021 07:00 - 08:00 | 0 | 0 | 0 | 0 |
| 22.11.2021 08:00 - 09:00 | 0 | 0 | 0 | 0 |
| 22.11.2021 09:00 - 10:00 | 0 | 0 | 0 | 0 |
| 22.11.2021 10:00 - 11:00 | 0 | 0 | 0 | 0 |
| 22.11.2021 11:00 - 12:00 | 0 | 0 | 0 | 0 |
| 22.11.2021 12:00 - 13:00 | 0 | 0 | 0 | 0 |
| 22.11.2021 13:00 - 14:00 | 0 | 0 | 0 | 0 |
| 22.11.2021 14:00 - 15:00 | 0 | 0 | 0 | 0 |
| 22.11.2021 15:00 - 16:00 | 0 | 0 | 0 | 0 |
| 22.11.2021 16:00 - 17:00 | 0 | 0 | 0 | 0 |
| 22.11.2021 17:00 - 18:00 | 0 | 0 | 0 | 0 |
| 22.11.2021 18:00 - 19:00 | 0 | 0 | 0 | 0 |
| 22.11.2021 19:00 - 20:00 | 0 | 0 | 0 | 0 |
| 22.11.2021 20:00 - 21:00 | 0 | 0 | 0 | 0 |
| 22.11.2021 21:00 - 22:00 | 300 | 0 | 0 | 0 |
| 22.11.2021 22:00 - 23:00 | 300 | 0 | 0 | 0 |
| 22.11.2021 23:00 - 24:00 | 300 | 0 | 0 | 0 |
| 23.11.2021 00:00 - 01:00 | 300 | 0 | 0 | 0 |
| 23.11.2021 01:00 - 02:00 | 300 | 0 | 0 | 0 |
| 23.11.2021 02:00 - 03:00 | 300 | 0 | 0 | 0 |
| 23.11.2021 03:00 - 04:00 | 300 | 0 | 0 | 0 |
| 23.11.2021 04:00 - 05:00 | 300 | 0 | 0 | 0 |
| 23.11.2021 05:00 - 06:00 | 300 | 0 | 0 | 0 |
| 23.11.2021 06:00 - 07:00 | 0 | 0 | 0 | 0 |
| 23.11.2021 07:00 - 08:00 | 0 | 0 | 0 | 0 |
| 23.11.2021 08:00 - 09:00 | 0 | 0 | 0 | 0 |
| 23.11.2021 09:00 - 10:00 | 0 | 0 | 0 | 0 |
| 23.11.2021 10:00 - 11:00 | 0 | 0 | 0 | 0 |
| 23.11.2021 11:00 - 12:00 | 0 | 0 | 0 | 0 |
| 23.11.2021 12:00 - 13:00 | 0 | 0 | 0 | 0 |
| 23.11.2021 13:00 - 14:00 | 0 | 0 | 0 | 0 |
| 23.11.2021 14:00 - 15:00 | 0 | 0 | 0 | 0 |
| 23.11.2021 15:00 - 16:00 | 0 | 0 | 0 | 0 |
| 23.11.2021 16:00 - 17:00 | 0 | 0 | 0 | 0 |
| 23.11.2021 17:00 - 18:00 | 0 | 0 | 0 | 0 |
| 23.11.2021 18:00 - 19:00 | 0 | 0 | 0 | 0 |
| 23.11.2021 19:00 - 20:00 | 0 | 0 | 0 | 0 |
| 23.11.2021 20:00 - 21:00 | 0 | 0 | 0 | 0 |
| 23.11.2021 21:00 - 22:00 | 0 | 0 | 0 | 0 |
| 23.11.2021 22:00 - 23:00 | 0 | 0 | 0 | 0 |
| 23.11.2021 23:00 - 24:00 | 0 | 0 | 0 | 0 |
| 24.11.2021 00:00 - 01:00 | 500 | 0 | 0 | 0 |
| 24.11.2021 01:00 - 02:00 | 500 | 0 | 0 | 0 |
| 24.11.2021 02:00 - 03:00 | 1000 | 0 | 0 | 0 |
| 24.11.2021 03:00 - 04:00 | 1000 | 0 | 0 | 0 |
| 24.11.2021 04:00 - 05:00 | 1000 | 0 | 0 | 0 |
| 24.11.2021 05:00 - 06:00 | 1000 | 0 | 0 | 0 |
| 24.11.2021 06:00 - 07:00 | 0 | 0 | 0 | 0 |
| 24.11.2021 07:00 - 08:00 | 0 | 0 | 0 | 0 |
| 24.11.2021 08:00 - 09:00 | 0 | 0 | 0 | 0 |
| 24.11.2021 09:00 - 10:00 | 0 | 0 | 0 | 0 |
| 24.11.2021 10:00 - 11:00 | 0 | 0 | 0 | 0 |
| 24.11.2021 11:00 - 12:00 | 0 | 0 | 0 | 0 |
| 24.11.2021 12:00 - 13:00 | 0 | 0 | 0 | 0 |
| 24.11.2021 13:00 - 14:00 | 0 | 0 | 0 | 0 |
| 24.11.2021 14:00 - 15:00 | 0 | 0 | 0 | 0 |
| 24.11.2021 15:00 - 16:00 | 0 | 0 | 0 | 0 |
| 24.11.2021 16:00 - 17:00 | 300 | 0 | 0 | 0 |
| 24.11.2021 17:00 - 18:00 | 300 | 0 | 0 | 0 |
| 24.11.2021 18:00 - 19:00 | 300 | 0 | 0 | 0 |
| 24.11.2021 19:00 - 20:00 | 300 | 0 | 0 | 0 |
| 24.11.2021 20:00 - 21:00 | 300 | 0 | 0 | 0 |
| 24.11.2021 21:00 - 22:00 | 300 | 0 | 0 | 0 |
| 24.11.2021 22:00 - 23:00 | 300 | 0 | 0 | 0 |
| 24.11.2021 23:00 - 24:00 | 800 | 0 | 0 | 0 |
| 25.11.2021 00:00 - 01:00 | 800 | 0 | 0 | 0 |
| 25.11.2021 01:00 - 02:00 | 800 | 0 | 0 | 0 |
| 25.11.2021 02:00 - 03:00 | 800 | 0 | 0 | 0 |
| 25.11.2021 03:00 - 04:00 | 800 | 0 | 0 | 0 |
| 25.11.2021 04:00 - 05:00 | 800 | 0 | 0 | 0 |
| 25.11.2021 05:00 - 06:00 | 800 | 0 | 0 | 0 |
| 25.11.2021 06:00 - 07:00 | 0 | 0 | 0 | 0 |
| 25.11.2021 07:00 - 08:00 | 0 | 0 | 0 | 0 |
| 25.11.2021 08:00 - 09:00 | 0 | 0 | 0 | 0 |
| 25.11.2021 09:00 - 10:00 | 0 | 0 | 0 | 0 |
| 25.11.2021 10:00 - 11:00 | 0 | 0 | 0 | 0 |
| 25.11.2021 11:00 - 12:00 | 0 | 0 | 0 | 0 |
| 25.11.2021 12:00 - 13:00 | 0 | 0 | 0 | 0 |
| 25.11.2021 13:00 - 14:00 | 0 | 0 | 0 | 0 |
| 25.11.2021 14:00 - 15:00 | 0 | 0 | 0 | 0 |
| 25.11.2021 15:00 - 16:00 | 0 | 0 | 0 | 0 |
| 25.11.2021 16:00 - 17:00 | 0 | 0 | 0 | 0 |
| 25.11.2021 17:00 - 18:00 | 0 | 0 | 0 | 0 |
| 25.11.2021 18:00 - 19:00 | 0 | 0 | 0 | 0 |
| 25.11.2021 19:00 - 20:00 | 0 | 0 | 0 | 0 |
| 25.11.2021 20:00 - 21:00 | 0 | 0 | 0 | 0 |
| 25.11.2021 21:00 - 22:00 | 0 | 0 | 0 | 0 |
| 25.11.2021 22:00 - 23:00 | 0 | 0 | 0 | 0 |
| 25.11.2021 23:00 - 24:00 | 0 | 0 | 0 | 0 |
| 26.11.2021 00:00 - 01:00 | 0 | 0 | 0 | 0 |
| 26.11.2021 01:00 - 02:00 | 0 | 0 | 0 | 0 |
| 26.11.2021 02:00 - 03:00 | 0 | 0 | 0 | 0 |
| 26.11.2021 03:00 - 04:00 | 0 | 0 | 0 | 0 |
| 26.11.2021 04:00 - 05:00 | 0 | 0 | 0 | 0 |
| 26.11.2021 05:00 - 06:00 | 0 | 0 | 0 | 0 |
| 26.11.2021 06:00 - 07:00 | 0 | 0 | 0 | 0 |
| 26.11.2021 07:00 - 08:00 | 0 | 0 | 0 | 0 |
| 26.11.2021 08:00 - 09:00 | 0 | 0 | 0 | 0 |
| 26.11.2021 09:00 - 10:00 | 0 | 0 | 0 | 0 |
| 26.11.2021 10:00 - 11:00 | 0 | 0 | 0 | 0 |
| 26.11.2021 11:00 - 12:00 | 0 | 0 | 0 | 0 |
| 26.11.2021 12:00 - 13:00 | 0 | 0 | 0 | 0 |
| 26.11.2021 13:00 - 14:00 | 0 | 0 | 0 | 0 |
| 26.11.2021 14:00 - 15:00 | 0 | 0 | 0 | 0 |
| 26.11.2021 15:00 - 16:00 | 0 | 0 | 0 | 0 |
| 26.11.2021 16:00 - 17:00 | 0 | 0 | 0 | 0 |
| 26.11.2021 17:00 - 18:00 | 0 | 0 | 0 | 0 |
| 26.11.2021 18:00 - 19:00 | 0 | 0 | 0 | 0 |
| 26.11.2021 19:00 - 20:00 | 0 | 0 | 0 | 0 |
| 26.11.2021 20:00 - 21:00 | 0 | 0 | 0 | 0 |
| 26.11.2021 21:00 - 22:00 | 0 | 0 | 0 | 0 |
| 26.11.2021 22:00 - 23:00 | 0 | 0 | 0 | 0 |
| 26.11.2021 23:00 - 24:00 | 0 | 0 | 0 | 0 |
| 27.11.2021 00:00 - 01:00 | 0 | 0 | 0 | 0 |
| 27.11.2021 01:00 - 02:00 | 0 | 0 | 0 | 0 |
| 27.11.2021 02:00 - 03:00 | 0 | 0 | 0 | 0 |
| 27.11.2021 03:00 - 04:00 | 0 | -800 | 0 | 0 |
| 27.11.2021 04:00 - 05:00 | 0 | -800 | 0 | 0 |
| 27.11.2021 05:00 - 06:00 | 0 | -800 | 0 | 0 |
| 27.11.2021 06:00 - 07:00 | 0 | 0 | 0 | 0 |
| 27.11.2021 07:00 - 08:00 | 0 | 0 | 0 | 0 |
| 27.11.2021 08:00 - 09:00 | 0 | -300 | 0 | 0 |
| 27.11.2021 09:00 - 10:00 | 0 | -300 | 0 | 0 |
| 27.11.2021 10:00 - 11:00 | 0 | -300 | 0 | 0 |
| 27.11.2021 11:00 - 12:00 | 0 | -300 | 0 | 0 |
| 27.11.2021 12:00 - 13:00 | 0 | -300 | 0 | 0 |
| 27.11.2021 13:00 - 14:00 | 0 | -300 | 0 | 0 |
| 27.11.2021 14:00 - 15:00 | 0 | -300 | 0 | 0 |
| 27.11.2021 15:00 - 16:00 | 0 | -300 | 0 | 0 |
| 27.11.2021 16:00 - 17:00 | 0 | -300 | 0 | 0 |
| 27.11.2021 17:00 - 18:00 | 0 | -300 | 0 | 0 |
| 27.11.2021 18:00 - 19:00 | 0 | -300 | 0 | 0 |
| 27.11.2021 19:00 - 20:00 | 0 | -300 | 0 | 0 |
| 27.11.2021 20:00 - 21:00 | 0 | -300 | 0 | 0 |
| 27.11.2021 21:00 - 22:00 | 0 | -300 | 0 | 0 |
| 27.11.2021 22:00 - 23:00 | 0 | -1100 | 0 | 0 |
| 27.11.2021 23:00 - 24:00 | 0 | -1100 | 0 | 0 |
| 28.11.2021 00:00 - 01:00 | 0 | -1900 | 0 | 0 |
| 28.11.2021 01:00 - 02:00 | 0 | -1900 | 0 | 0 |
| 28.11.2021 02:00 - 03:00 | 0 | -1900 | 0 | 0 |
| 28.11.2021 03:00 - 04:00 | 0 | -1900 | 0 | 0 |
| 28.11.2021 04:00 - 05:00 | 0 | -1900 | 0 | 0 |
| 28.11.2021 05:00 - 06:00 | 0 | -1900 | 0 | 0 |
| 28.11.2021 06:00 - 07:00 | 0 | 0 | 0 | 0 |
| 28.11.2021 07:00 - 08:00 | 0 | 0 | 0 | 0 |
| 28.11.2021 08:00 - 09:00 | 0 | -300 | 0 | 0 |
| 28.11.2021 09:00 - 10:00 | 0 | -300 | 0 | 0 |
| 28.11.2021 10:00 - 11:00 | 0 | -300 | 0 | 0 |
| 28.11.2021 11:00 - 12:00 | 0 | -300 | 0 | 0 |
| 28.11.2021 12:00 - 13:00 | 0 | -300 | 0 | 0 |
| 28.11.2021 13:00 - 14:00 | 0 | -300 | 0 | 0 |
| 28.11.2021 14:00 - 15:00 | 0 | -300 | 0 | 0 |
| 28.11.2021 15:00 - 16:00 | 0 | -600 | 0 | 0 |
| 28.11.2021 16:00 - 17:00 | 0 | -600 | 0 | 0 |
| 28.11.2021 17:00 - 18:00 | 0 | -600 | 0 | 0 |
| 28.11.2021 18:00 - 19:00 | 0 | -600 | 0 | 0 |
| 28.11.2021 19:00 - 20:00 | 0 | -600 | 0 | 0 |
| 28.11.2021 20:00 - 21:00 | 0 | -600 | 0 | 0 |
| 28.11.2021 21:00 - 22:00 | 0 | -600 | 0 | 0 |
| 28.11.2021 22:00 - 23:00 | 0 | -600 | 0 | 0 |
| 28.11.2021 23:00 - 24:00 | 0 | -600 | 0 | 0 |
| 29.11.2021 00:00 - 01:00 | 0 | -600 | 0 | 0 |
| 29.11.2021 01:00 - 02:00 | 0 | -600 | 0 | 0 |
| 29.11.2021 02:00 - 03:00 | 0 | -600 | 0 | 0 |
| 29.11.2021 03:00 - 04:00 | 0 | -600 | 0 | 0 |
| 29.11.2021 04:00 - 05:00 | 0 | -600 | 0 | 0 |
| 29.11.2021 05:00 - 06:00 | 0 | -600 | 0 | 0 |
| 29.11.2021 06:00 - 07:00 | 0 | 0 | 0 | 0 |
| 29.11.2021 07:00 - 08:00 | 0 | 0 | 0 | 0 |
| 29.11.2021 08:00 - 09:00 | 0 | 0 | 0 | 0 |
| 29.11.2021 09:00 - 10:00 | 0 | 0 | 0 | 0 |
| 29.11.2021 10:00 - 11:00 | 0 | 0 | 0 | 0 |
| 29.11.2021 11:00 - 12:00 | 0 | 0 | 0 | 0 |
| 29.11.2021 12:00 - 13:00 | 0 | 0 | 0 | 0 |
| 29.11.2021 13:00 - 14:00 | 0 | 0 | 0 | 0 |
| 29.11.2021 14:00 - 15:00 | 0 | 0 | 0 | 0 |
| 29.11.2021 15:00 - 16:00 | 0 | 0 | 0 | 0 |
| 29.11.2021 16:00 - 17:00 | 0 | 0 | 0 | 0 |
| 29.11.2021 17:00 - 18:00 | 0 | 0 | 0 | 0 |
| 29.11.2021 18:00 - 19:00 | 0 | 0 | 0 | 0 |
| 29.11.2021 19:00 - 20:00 | 0 | -500 | 0 | 0 |
| 29.11.2021 20:00 - 21:00 | 0 | -500 | 0 | 0 |
| 29.11.2021 21:00 - 22:00 | 0 | -500 | 0 | 0 |
| 29.11.2021 22:00 - 23:00 | 0 | -1000 | 0 | 0 |
| 29.11.2021 23:00 - 24:00 | 0 | -1000 | 0 | 0 |
| 30.11.2021 00:00 - 01:00 | 0 | -1000 | 0 | 0 |
| 30.11.2021 01:00 - 02:00 | 0 | -1000 | 0 | 0 |
| 30.11.2021 02:00 - 03:00 | 0 | -1000 | 0 | 0 |
| 30.11.2021 03:00 - 04:00 | 0 | -1000 | 0 | 0 |
| 30.11.2021 04:00 - 05:00 | 0 | -1000 | 0 | 0 |
| 30.11.2021 05:00 - 06:00 | 0 | -1000 | 0 | 0 |
| 30.11.2021 06:00 - 07:00 | 0 | 0 | 0 | 0 |
| 30.11.2021 07:00 - 08:00 | 0 | 0 | 0 | 0 |
| 30.11.2021 08:00 - 09:00 | 0 | 0 | 0 | 0 |
| 30.11.2021 09:00 - 10:00 | 0 | 0 | 0 | 0 |
| 30.11.2021 10:00 - 11:00 | 0 | 0 | 0 | 0 |
| 30.11.2021 11:00 - 12:00 | 0 | 0 | 0 | 0 |
| 30.11.2021 12:00 - 13:00 | 0 | 0 | 0 | 0 |
| 30.11.2021 13:00 - 14:00 | 0 | 0 | 0 | 0 |
| 30.11.2021 14:00 - 15:00 | 0 | 0 | 0 | 0 |
| 30.11.2021 15:00 - 16:00 | 0 | 0 | 0 | 0 |
| 30.11.2021 16:00 - 17:00 | 0 | 0 | 0 | 0 |
| 30.11.2021 17:00 - 18:00 | 0 | 0 | 0 | 0 |
| 30.11.2021 18:00 - 19:00 | 0 | 0 | 0 | 0 |
| 30.11.2021 19:00 - 20:00 | 0 | 0 | 0 | 0 |
| 30.11.2021 20:00 - 21:00 | 0 | 0 | 0 | 0 |
| 30.11.2021 21:00 - 22:00 | 0 | -200 | 0 | 0 |
| 30.11.2021 22:00 - 23:00 | 0 | -800 | 0 | 0 |
| 30.11.2021 23:00 - 24:00 | 0 | -800 | 0 | 0 |
| 01.12.2021 00:00 - 01:00 | 0 | -800 | 0 | 0 |
| 01.12.2021 01:00 - 02:00 | 0 | -800 | 0 | 0 |
| 01.12.2021 02:00 - 03:00 | 0 | -800 | 0 | 0 |
| 01.12.2021 03:00 - 04:00 | 0 | -800 | 0 | 0 |
| 01.12.2021 04:00 - 05:00 | 0 | -800 | 0 | 0 |
| 01.12.2021 05:00 - 06:00 | 0 | -800 | 0 | 0 |